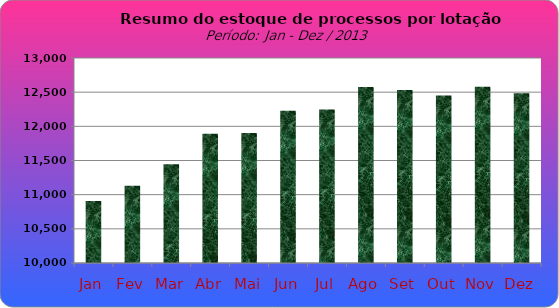
| Category | Series 0 |
|---|---|
| Jan | 10909 |
| Fev | 11131 |
| Mar | 11446 |
| Abr | 11893 |
| Mai | 11901 |
| Jun | 12228 |
| Jul | 12248 |
| Ago | 12576 |
| Set | 12532 |
| Out | 12450 |
| Nov | 12580 |
| Dez | 12485 |